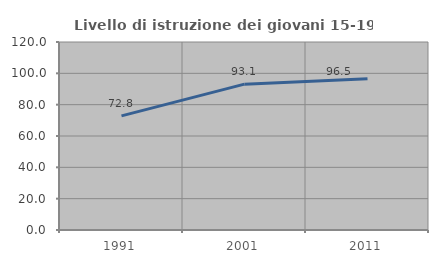
| Category | Livello di istruzione dei giovani 15-19 anni |
|---|---|
| 1991.0 | 72.816 |
| 2001.0 | 93.097 |
| 2011.0 | 96.507 |